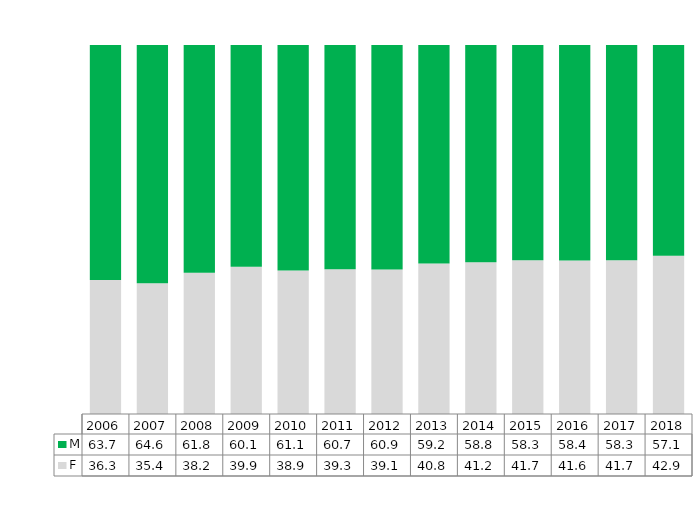
| Category | F | M |
|---|---|---|
| 2006.0 | 0.363 | 0.637 |
| 2007.0 | 0.354 | 0.646 |
| 2008.0 | 0.382 | 0.618 |
| 2009.0 | 0.399 | 0.601 |
| 2010.0 | 0.389 | 0.611 |
| 2011.0 | 0.393 | 0.607 |
| 2012.0 | 0.391 | 0.609 |
| 2013.0 | 0.408 | 0.592 |
| 2014.0 | 0.412 | 0.588 |
| 2015.0 | 0.417 | 0.583 |
| 2016.0 | 0.416 | 0.584 |
| 2017.0 | 0.417 | 0.583 |
| 2018.0 | 0.429 | 0.571 |